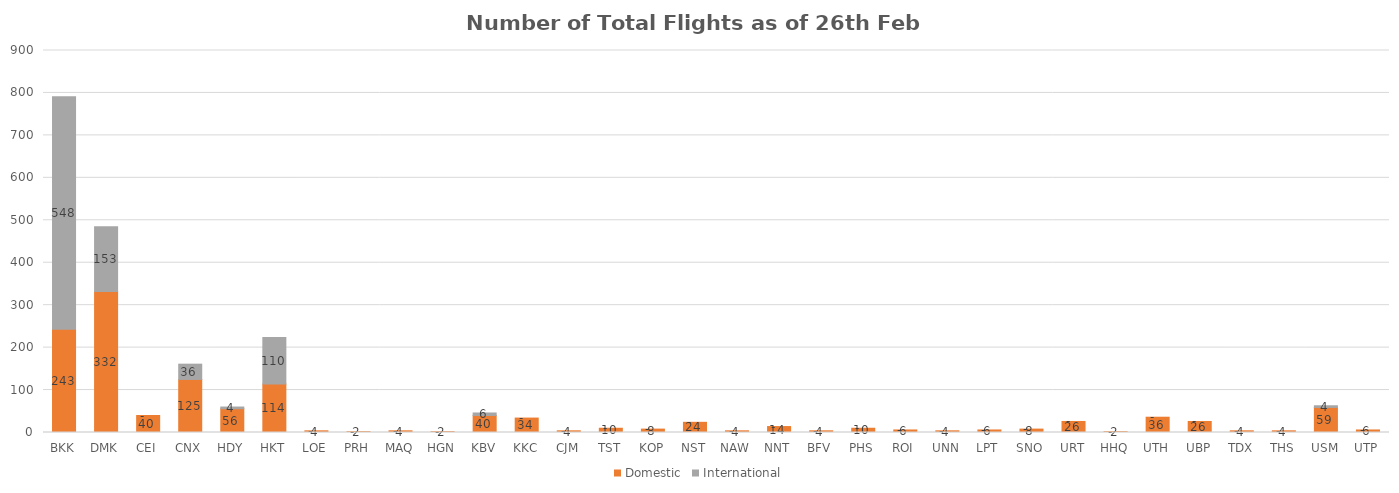
| Category | Domestic | International |
|---|---|---|
| BKK | 243 | 548 |
| DMK | 332 | 153 |
| CEI | 40 | 0 |
| CNX | 125 | 36 |
| HDY | 56 | 4 |
| HKT | 114 | 110 |
| LOE | 4 | 0 |
| PRH | 2 | 0 |
| MAQ | 4 | 0 |
| HGN | 2 | 0 |
| KBV | 40 | 6 |
| KKC | 34 | 0 |
| CJM | 4 | 0 |
| TST | 10 | 0 |
| KOP | 8 | 0 |
| NST | 24 | 0 |
| NAW | 4 | 0 |
| NNT | 14 | 0 |
| BFV | 4 | 0 |
| PHS | 10 | 0 |
| ROI | 6 | 0 |
| UNN | 4 | 0 |
| LPT | 6 | 0 |
| SNO | 8 | 0 |
| URT | 26 | 0 |
| HHQ | 2 | 0 |
| UTH | 36 | 0 |
| UBP | 26 | 0 |
| TDX | 4 | 0 |
| THS | 4 | 0 |
| USM | 59 | 4 |
| UTP | 6 | 0 |